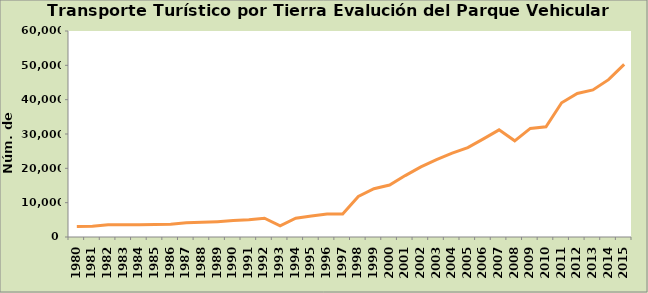
| Category | Series 0 |
|---|---|
| 1980.0 | 3070 |
| 1981.0 | 3150 |
| 1982.0 | 3550 |
| 1983.0 | 3589 |
| 1984.0 | 3596 |
| 1985.0 | 3674 |
| 1986.0 | 3718 |
| 1987.0 | 4127 |
| 1988.0 | 4266 |
| 1989.0 | 4476 |
| 1990.0 | 4782 |
| 1991.0 | 5005 |
| 1992.0 | 5481 |
| 1993.0 | 3240 |
| 1994.0 | 5476 |
| 1995.0 | 6137 |
| 1996.0 | 6706 |
| 1997.0 | 6729 |
| 1998.0 | 11793 |
| 1999.0 | 14048 |
| 2000.0 | 15124 |
| 2001.0 | 17889 |
| 2002.0 | 20424 |
| 2003.0 | 22561 |
| 2004.0 | 24419 |
| 2005.0 | 26044 |
| 2006.0 | 28579 |
| 2007.0 | 31203 |
| 2008.0 | 28008 |
| 2009.0 | 31619 |
| 2010.0 | 32105 |
| 2011.0 | 39093 |
| 2012.0 | 41813 |
| 2013.0 | 42836 |
| 2014.0 | 45817 |
| 2015.0 | 50284 |